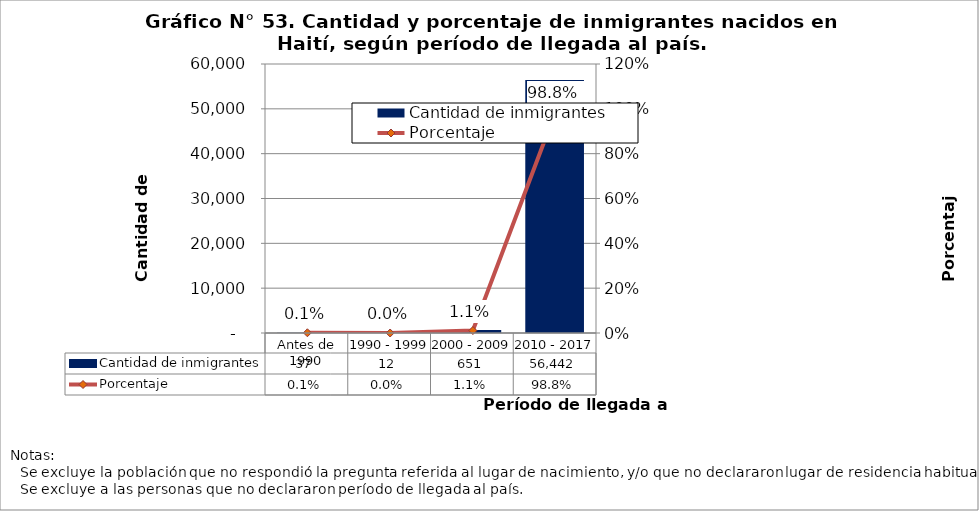
| Category | Cantidad de inmigrantes |
|---|---|
| Antes de 1990 | 37 |
| 1990 - 1999 | 12 |
| 2000 - 2009 | 651 |
| 2010 - 2017 | 56442 |